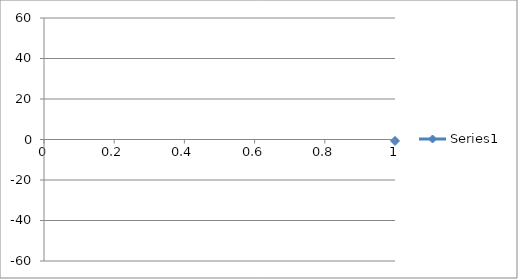
| Category | Series 0 |
|---|---|
| 0 | -0.7 |
| 1 | 3.2 |
| 2 | 1.7 |
| 3 | -3.9 |
| 4 | -0.6 |
| 5 | -0.4 |
| 6 | 1.9 |
| 7 | -0.3 |
| 8 | 2.5 |
| 9 | -0.7 |
| 10 | -0.9 |
| 11 | 1.7 |
| 12 | 1.3 |
| 13 | -2.2 |
| 14 | 0.2 |
| 15 | 1.5 |
| 16 | -0.3 |
| 17 | -1.3 |
| 18 | 1 |
| 19 | 2.3 |
| 20 | -1 |
| 21 | -1.6 |
| 22 | 2.3 |
| 23 | 0.4 |
| 24 | 1 |
| 25 | -0.1 |
| 26 | -0.8 |
| 27 | 0.3 |
| 28 | -0.6 |
| 29 | 1.4 |
| 30 | 0.6 |
| 31 | -2.3 |
| 32 | -3 |
| 33 | 1.5 |
| 34 | -1.6 |
| 35 | -2.1 |
| 36 | -0.4 |
| 37 | -0.5 |
| 38 | -2.8 |
| 39 | 0.5 |
| 40 | -0.8 |
| 41 | -0.1 |
| 42 | -3.5 |
| 43 | 1.6 |
| 44 | -1.1 |
| 45 | 0.6 |
| 46 | 4.6 |
| 47 | 6.5 |
| 48 | 7.7 |
| 49 | 6.8 |
| 50 | 3.5 |
| 51 | 6.7 |
| 52 | 6.9 |
| 53 | 6.7 |
| 54 | 3.6 |
| 55 | 8.7 |
| 56 | 2 |
| 57 | 6.8 |
| 58 | 9.8 |
| 59 | 0.8 |
| 60 | 6.9 |
| 61 | -4.6 |
| 62 | -5.7 |
| 63 | -3 |
| 64 | -5.5 |
| 65 | -4.8 |
| 66 | -8.9 |
| 67 | -1.4 |
| 68 | -9.7 |
| 69 | -1.8 |
| 70 | -8.5 |
| 71 | -2 |
| 72 | -5.3 |
| 73 | -7.2 |
| 74 | -5 |
| 75 | 4.7 |
| 76 | 6.2 |
| 77 | 13.3 |
| 78 | 14.8 |
| 79 | 5.3 |
| 80 | 12.5 |
| 81 | 9.1 |
| 82 | 11.1 |
| 83 | 12.5 |
| 84 | 8.7 |
| 85 | 13.2 |
| 86 | 8.3 |
| 87 | 12.1 |
| 88 | 12 |
| 89 | 10.1 |
| 90 | 2.8 |
| 91 | -7.8 |
| 92 | -8.9 |
| 93 | -11.5 |
| 94 | -9.9 |
| 95 | -11 |
| 96 | -10.9 |
| 97 | -10.3 |
| 98 | -8.1 |
| 99 | -13.2 |
| 100 | -12.1 |
| 101 | -10.3 |
| 102 | -9 |
| 103 | -12.5 |
| 104 | -10.2 |
| 105 | -1.3 |
| 106 | 12.9 |
| 107 | 15.9 |
| 108 | 16.5 |
| 109 | 14.9 |
| 110 | 16 |
| 111 | 15.6 |
| 112 | 13.7 |
| 113 | 16.4 |
| 114 | 16 |
| 115 | 15.1 |
| 116 | 17.1 |
| 117 | 18.8 |
| 118 | 15.6 |
| 119 | 21.6 |
| 120 | -6.7 |
| 121 | -18.2 |
| 122 | -19.5 |
| 123 | -17.8 |
| 124 | -19.3 |
| 125 | -19.4 |
| 126 | -18.9 |
| 127 | -21.4 |
| 128 | -18.4 |
| 129 | -25.5 |
| 130 | -20.9 |
| 131 | -18.8 |
| 132 | -27.8 |
| 133 | -20 |
| 134 | -24.1 |
| 135 | 4.5 |
| 136 | 24.1 |
| 137 | 25.4 |
| 138 | 23 |
| 139 | 23.2 |
| 140 | 22.7 |
| 141 | 27.8 |
| 142 | 28 |
| 143 | 23 |
| 144 | 31.1 |
| 145 | 26.8 |
| 146 | 28.1 |
| 147 | 25.6 |
| 148 | 28 |
| 149 | 27.1 |
| 150 | -12.4 |
| 151 | -38.5 |
| 152 | -41.4 |
| 153 | -30.2 |
| 154 | -40.4 |
| 155 | -32.6 |
| 156 | -37.1 |
| 157 | -49.6 |
| 158 | -47.4 |
| 159 | -41.3 |
| 160 | -37.4 |
| 161 | -38.7 |
| 162 | -34.2 |
| 163 | -39.7 |
| 164 | -33 |
| 165 | -27 |
| 166 | 41.5 |
| 167 | 44.6 |
| 168 | 40.4 |
| 169 | 45.9 |
| 170 | 43.2 |
| 171 | 39.7 |
| 172 | 45.3 |
| 173 | 39.3 |
| 174 | 38.9 |
| 175 | 45 |
| 176 | 50.7 |
| 177 | 38.2 |
| 178 | 47.7 |
| 179 | 45.5 |